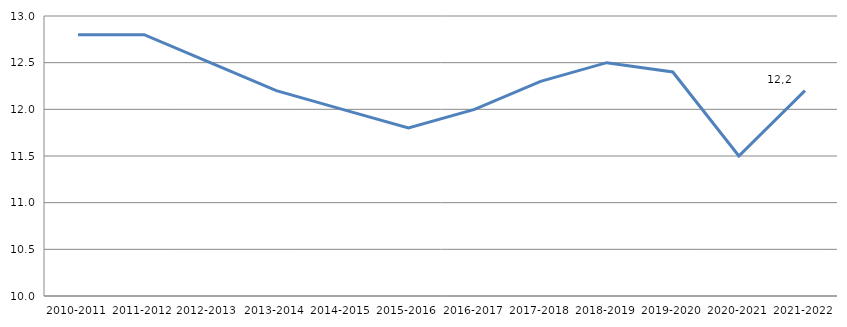
| Category | Series 0 |
|---|---|
| 2010-2011 | 12.8 |
| 2011-2012 | 12.8 |
| 2012-2013  | 12.5 |
| 2013-2014 | 12.2 |
| 2014-2015 | 12 |
| 2015-2016 | 11.8 |
| 2016-2017 | 12 |
| 2017-2018 | 12.3 |
| 2018-2019 | 12.5 |
| 2019-2020 | 12.4 |
| 2020-2021 | 11.5 |
| 2021-2022 | 12.2 |